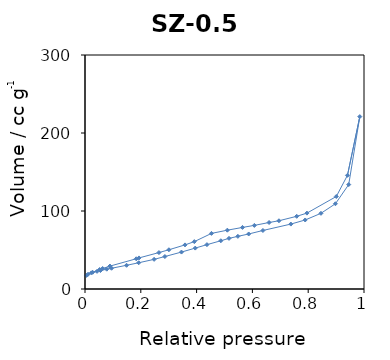
| Category | Series 0 |
|---|---|
| 0.005476 | 17.428 |
| 0.010861 | 18.889 |
| 0.022914 | 20.706 |
| 0.043197 | 22.652 |
| 0.05526 | 23.657 |
| 0.077928 | 25.394 |
| 0.095029 | 26.598 |
| 0.148943 | 30.377 |
| 0.192523 | 33.653 |
| 0.247704 | 38.011 |
| 0.286341 | 41.611 |
| 0.345818 | 47.345 |
| 0.395138 | 52.438 |
| 0.436956 | 56.848 |
| 0.486895 | 61.855 |
| 0.516134 | 64.927 |
| 0.547896 | 67.504 |
| 0.586787 | 70.55 |
| 0.637791 | 75.039 |
| 0.737825 | 83.223 |
| 0.789225 | 88.501 |
| 0.84571 | 97.032 |
| 0.897603 | 109.288 |
| 0.945184 | 133.908 |
| 0.98501 | 221.002 |
| 0.940746 | 145.717 |
| 0.900661 | 118.578 |
| 0.795451 | 97.277 |
| 0.758933 | 93.218 |
| 0.695245 | 87.487 |
| 0.659682 | 85.237 |
| 0.607071 | 81.551 |
| 0.564478 | 78.945 |
| 0.510186 | 75.413 |
| 0.453333 | 71.275 |
| 0.391803 | 60.731 |
| 0.358491 | 56.546 |
| 0.300743 | 50.303 |
| 0.264951 | 46.687 |
| 0.193558 | 39.825 |
| 0.183617 | 38.742 |
| 0.089439 | 29.344 |
| 0.088935 | 29.2 |
| 0.063186 | 26.288 |
| 0.052577 | 24.978 |
| 0.027316 | 21.425 |